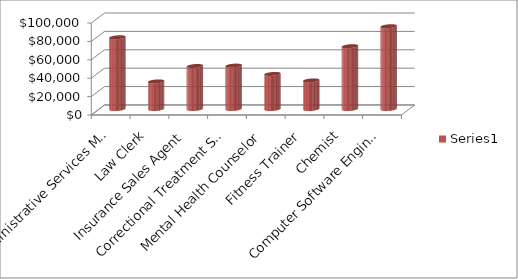
| Category | Series 0 |
|---|---|
| Administrative Services Manager | 78000 |
| Law Clerk | 30000 |
| Insurance Sales Agent | 46770 |
| Correctional Treatment Specialists | 47200 |
| Mental Health Counselor | 38150 |
| Fitness Trainer | 31090 |
| Chemist | 68320 |
| Computer Software Engineer | 90000 |